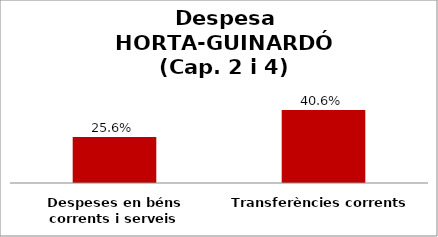
| Category | Series 0 |
|---|---|
| Despeses en béns corrents i serveis | 0.256 |
| Transferències corrents | 0.406 |